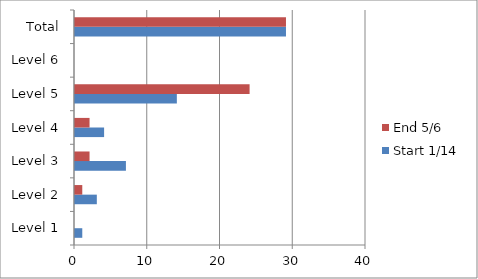
| Category | Start 1/14 | End 5/6 |
|---|---|---|
| Level 1 | 1 | 0 |
| Level 2 | 3 | 1 |
| Level 3 | 7 | 2 |
| Level 4 | 4 | 2 |
| Level 5 | 14 | 24 |
| Level 6 | 0 | 0 |
| Total | 29 | 29 |